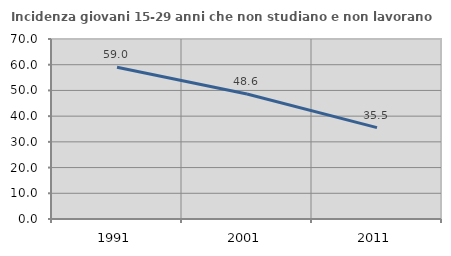
| Category | Incidenza giovani 15-29 anni che non studiano e non lavorano  |
|---|---|
| 1991.0 | 59.011 |
| 2001.0 | 48.627 |
| 2011.0 | 35.543 |